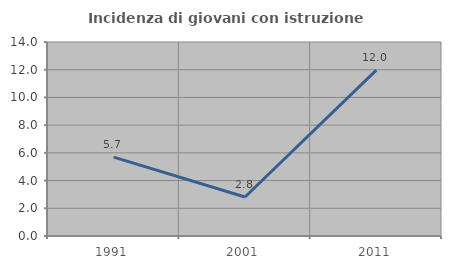
| Category | Incidenza di giovani con istruzione universitaria |
|---|---|
| 1991.0 | 5.691 |
| 2001.0 | 2.817 |
| 2011.0 | 11.966 |